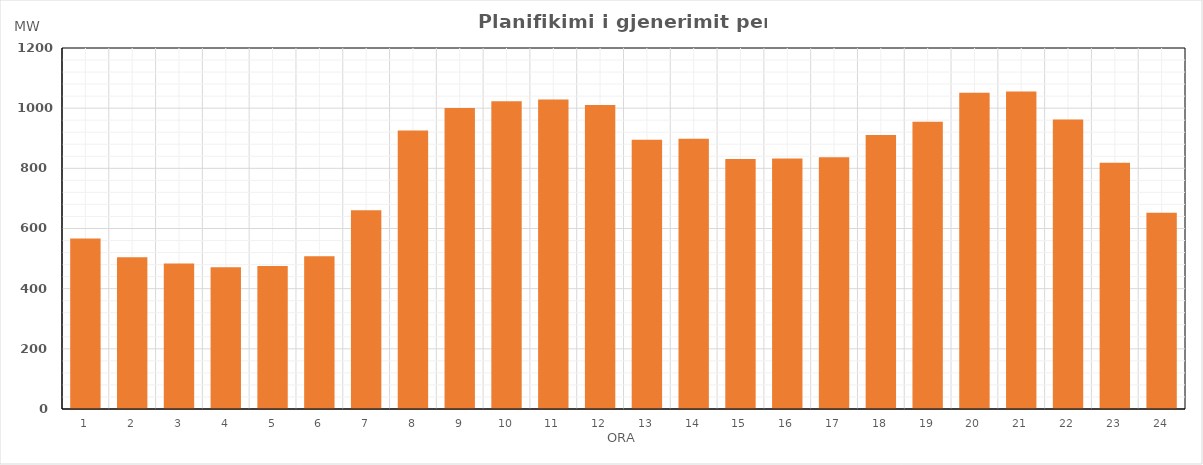
| Category | Max (MW) |
|---|---|
| 0 | 566.47 |
| 1 | 504.25 |
| 2 | 483.53 |
| 3 | 471.34 |
| 4 | 475.01 |
| 5 | 507.4 |
| 6 | 660.47 |
| 7 | 925.35 |
| 8 | 1000.74 |
| 9 | 1022.87 |
| 10 | 1028.95 |
| 11 | 1010.6 |
| 12 | 894.78 |
| 13 | 898.02 |
| 14 | 830.81 |
| 15 | 832.34 |
| 16 | 837.03 |
| 17 | 911.1 |
| 18 | 954.68 |
| 19 | 1050.88 |
| 20 | 1055 |
| 21 | 962.7 |
| 22 | 818.7 |
| 23 | 652.63 |